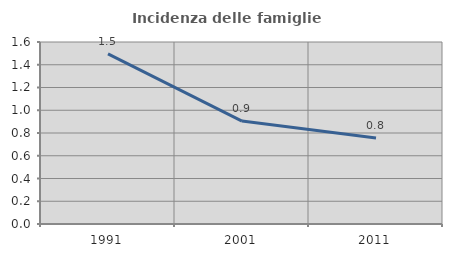
| Category | Incidenza delle famiglie numerose |
|---|---|
| 1991.0 | 1.496 |
| 2001.0 | 0.905 |
| 2011.0 | 0.757 |